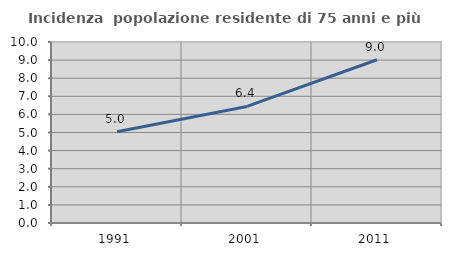
| Category | Incidenza  popolazione residente di 75 anni e più |
|---|---|
| 1991.0 | 5.038 |
| 2001.0 | 6.441 |
| 2011.0 | 9.019 |